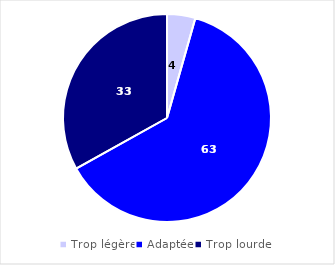
| Category | Series 0 |
|---|---|
| Trop légère | 4.4 |
| Adaptée | 62.52 |
| Trop lourde | 33.08 |